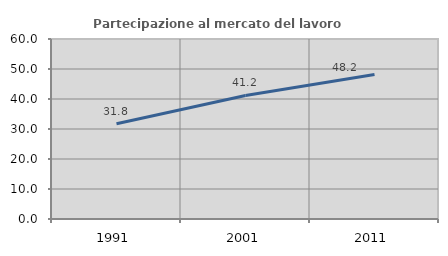
| Category | Partecipazione al mercato del lavoro  femminile |
|---|---|
| 1991.0 | 31.773 |
| 2001.0 | 41.176 |
| 2011.0 | 48.193 |